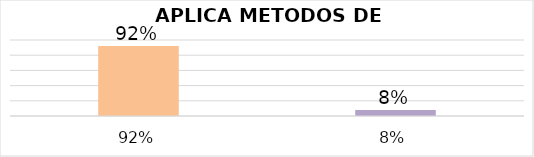
| Category | Series 4 |
|---|---|
| 0.92 | 0.92 |
| 0.08 | 0.08 |